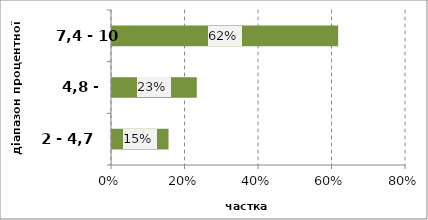
| Category | Series 0 |
|---|---|
| 2 - 4,7 | 0.154 |
| 4,8 - 7,3 | 0.231 |
| 7,4 - 10 | 0.615 |